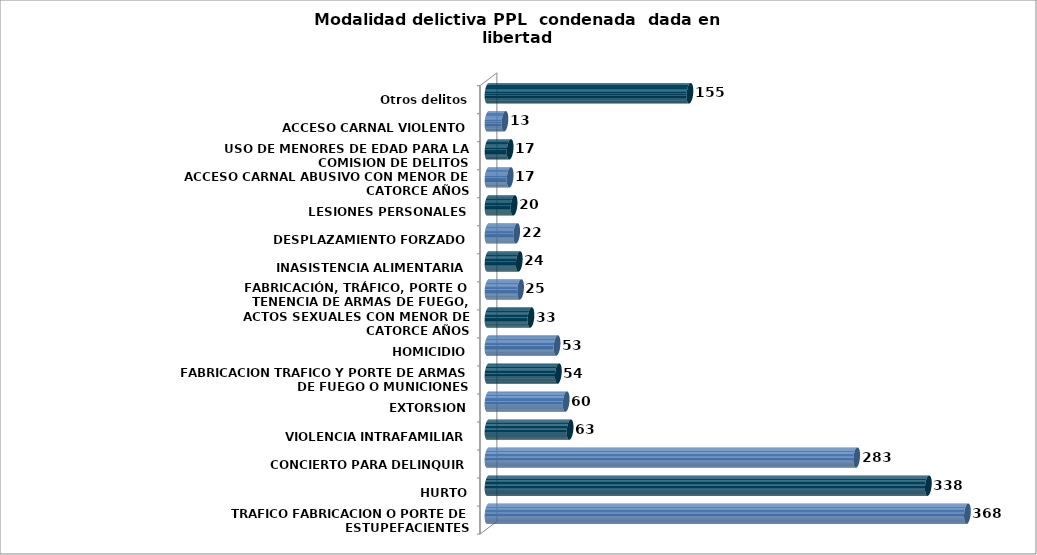
| Category | Series 0 |
|---|---|
| TRAFICO FABRICACION O PORTE DE ESTUPEFACIENTES | 368 |
| HURTO | 338 |
| CONCIERTO PARA DELINQUIR | 283 |
| VIOLENCIA INTRAFAMILIAR | 63 |
| EXTORSION | 60 |
| FABRICACION TRAFICO Y PORTE DE ARMAS DE FUEGO O MUNICIONES | 54 |
| HOMICIDIO | 53 |
| ACTOS SEXUALES CON MENOR DE CATORCE AÑOS | 33 |
| FABRICACIÓN, TRÁFICO, PORTE O TENENCIA DE ARMAS DE FUEGO, ACCESORIOS, PARTES O MUNICIONES | 25 |
| INASISTENCIA ALIMENTARIA | 24 |
| DESPLAZAMIENTO FORZADO | 22 |
| LESIONES PERSONALES | 20 |
| ACCESO CARNAL ABUSIVO CON MENOR DE CATORCE AÑOS | 17 |
| USO DE MENORES DE EDAD PARA LA COMISION DE DELITOS | 17 |
| ACCESO CARNAL VIOLENTO | 13 |
| Otros delitos | 155 |